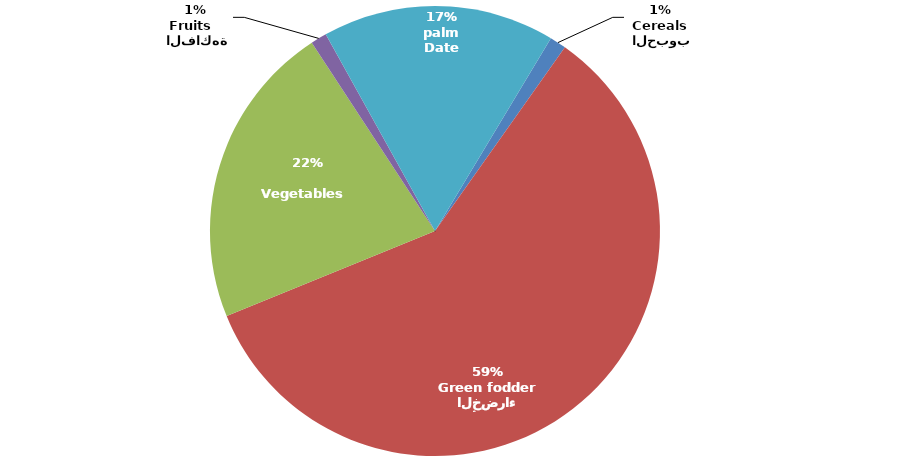
| Category | Series 0 |
|---|---|
|  الحبوب
Cereals | 0.012 |
| الأعلاف الخضراء
Green fodder | 0.59 |
| الخضروات
Vegetables     | 0.219 |
|  الفاكهة
Fruits   | 0.012 |
|  النخيل
Date palm | 0.167 |